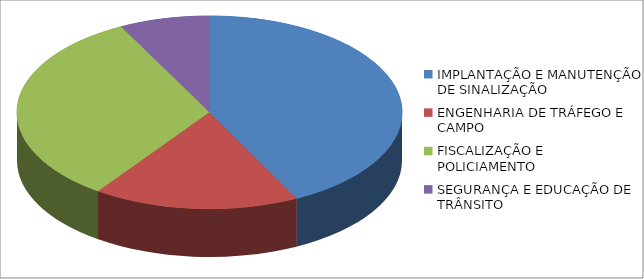
| Category | Series 0 | Series 1 |
|---|---|---|
| IMPLANTAÇÃO E MANUTENÇÃO DE SINALIZAÇÃO | 2217041.17 |  |
| ENGENHARIA DE TRÁFEGO E CAMPO | 899302.83 |  |
| FISCALIZAÇÃO E POLICIAMENTO | 1698692.63 |  |
| SEGURANÇA E EDUCAÇÃO DE TRÂNSITO | 395110.2 |  |